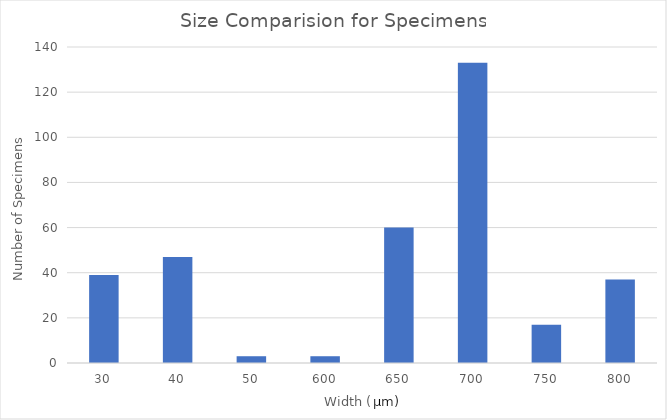
| Category | Series 0 |
|---|---|
| 30.0 | 39 |
| 40.0 | 47 |
| 50.0 | 3 |
| 600.0 | 3 |
| 650.0 | 60 |
| 700.0 | 133 |
| 750.0 | 17 |
| 800.0 | 37 |